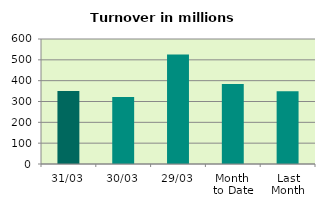
| Category | Series 0 |
|---|---|
| 31/03 | 349.81 |
| 30/03 | 322.13 |
| 29/03 | 526.142 |
| Month 
to Date | 383.695 |
| Last
Month | 349.641 |